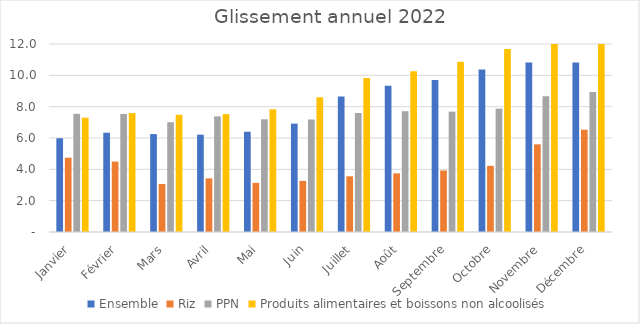
| Category | Ensemble | Riz | PPN | Produits alimentaires et boissons non alcoolisés |
|---|---|---|---|---|
| Janvier | 5.984 | 4.745 | 7.54 | 7.297 |
| Février | 6.337 | 4.495 | 7.537 | 7.591 |
| Mars | 6.249 | 3.066 | 7.006 | 7.484 |
| Avril | 6.212 | 3.424 | 7.38 | 7.523 |
| Mai | 6.399 | 3.134 | 7.195 | 7.832 |
| Juin | 6.919 | 3.263 | 7.182 | 8.599 |
| Juillet | 8.653 | 3.555 | 7.593 | 9.833 |
| Août | 9.327 | 3.744 | 7.709 | 10.254 |
| Septembre | 9.698 | 3.929 | 7.684 | 10.86 |
| Octobre | 10.366 | 4.224 | 7.875 | 11.681 |
| Novembre | 10.824 | 5.593 | 8.673 | 12.372 |
| Décembre | 10.823 | 6.527 | 8.929 | 12.57 |